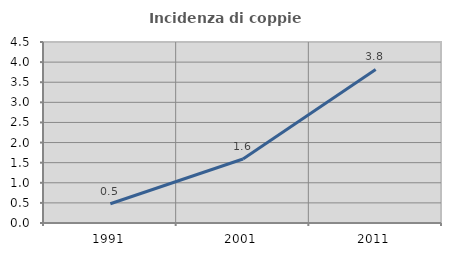
| Category | Incidenza di coppie miste |
|---|---|
| 1991.0 | 0.479 |
| 2001.0 | 1.592 |
| 2011.0 | 3.819 |